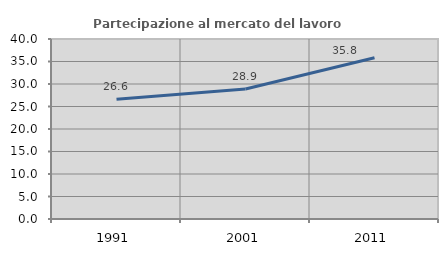
| Category | Partecipazione al mercato del lavoro  femminile |
|---|---|
| 1991.0 | 26.587 |
| 2001.0 | 28.897 |
| 2011.0 | 35.841 |